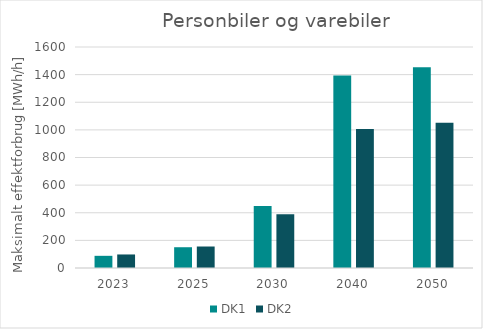
| Category | DK1 | DK2 |
|---|---|---|
| 2023.0 | 88.177 | 98.006 |
| 2025.0 | 150.363 | 155.622 |
| 2030.0 | 449.214 | 388.998 |
| 2040.0 | 1392.944 | 1006.896 |
| 2050.0 | 1453.678 | 1050.805 |